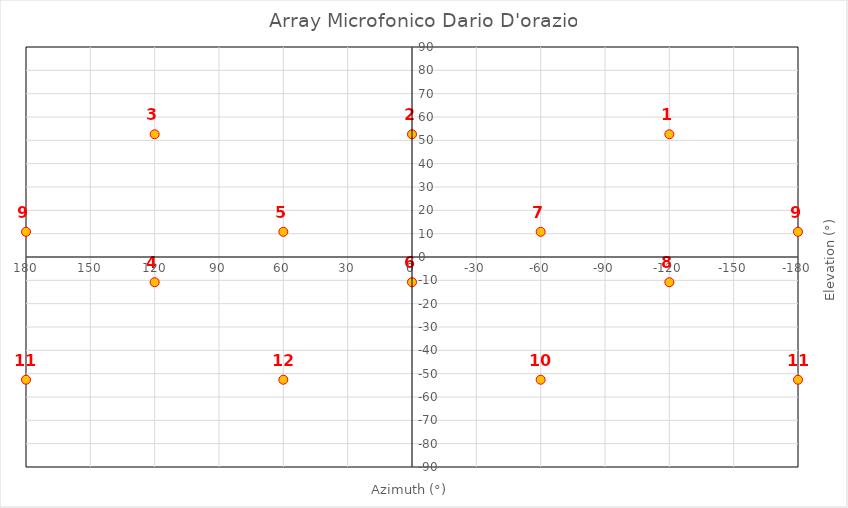
| Category | Series 0 |
|---|---|
| -120.0 | 52.6 |
| 0.0 | 52.6 |
| 120.0 | 52.6 |
| 120.0 | -10.8 |
| 60.0 | 10.8 |
| 0.0 | -10.8 |
| -60.0 | 10.8 |
| -120.0 | -10.8 |
| 180.0 | 10.8 |
| -60.0 | -52.6 |
| 180.0 | -52.6 |
| 60.0 | -52.6 |
| -180.0 | 10.8 |
| -180.0 | -52.6 |